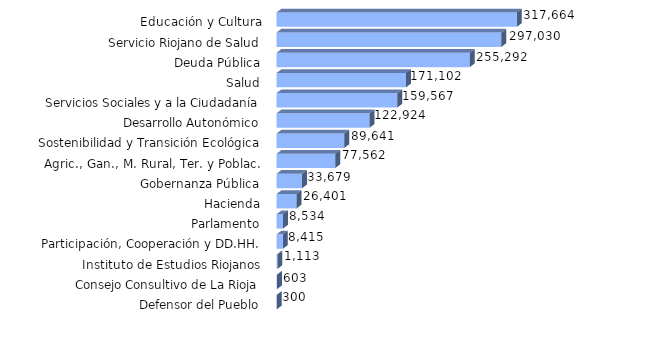
| Category | Series 0 |
|---|---|
| Defensor del Pueblo | 300 |
| Consejo Consultivo de La Rioja | 602.5 |
| Instituto de Estudios Riojanos | 1113.11 |
| Participación, Cooperación y DD.HH. | 8415.44 |
| Parlamento | 8533.51 |
| Hacienda | 26401.34 |
| Gobernanza Pública | 33679.35 |
| Agric., Gan., M. Rural, Ter. y Poblac. | 77562.15 |
| Sostenibilidad y Transición Ecológica | 89641.36 |
| Desarrollo Autonómico | 122923.58 |
| Servicios Sociales y a la Ciudadanía | 159567.16 |
| Salud | 171102.49 |
| Deuda Pública | 255292.15 |
| Servicio Riojano de Salud | 297029.91 |
| Educación y Cultura | 317664.06 |